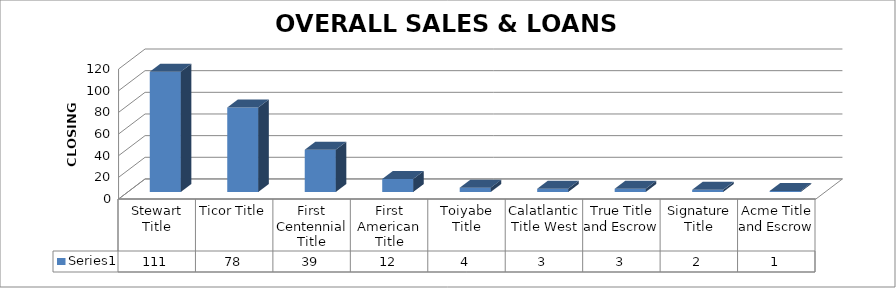
| Category | Series 0 |
|---|---|
| Stewart Title | 111 |
| Ticor Title | 78 |
| First Centennial Title | 39 |
| First American Title | 12 |
| Toiyabe Title | 4 |
| Calatlantic Title West | 3 |
| True Title and Escrow | 3 |
| Signature Title | 2 |
| Acme Title and Escrow | 1 |